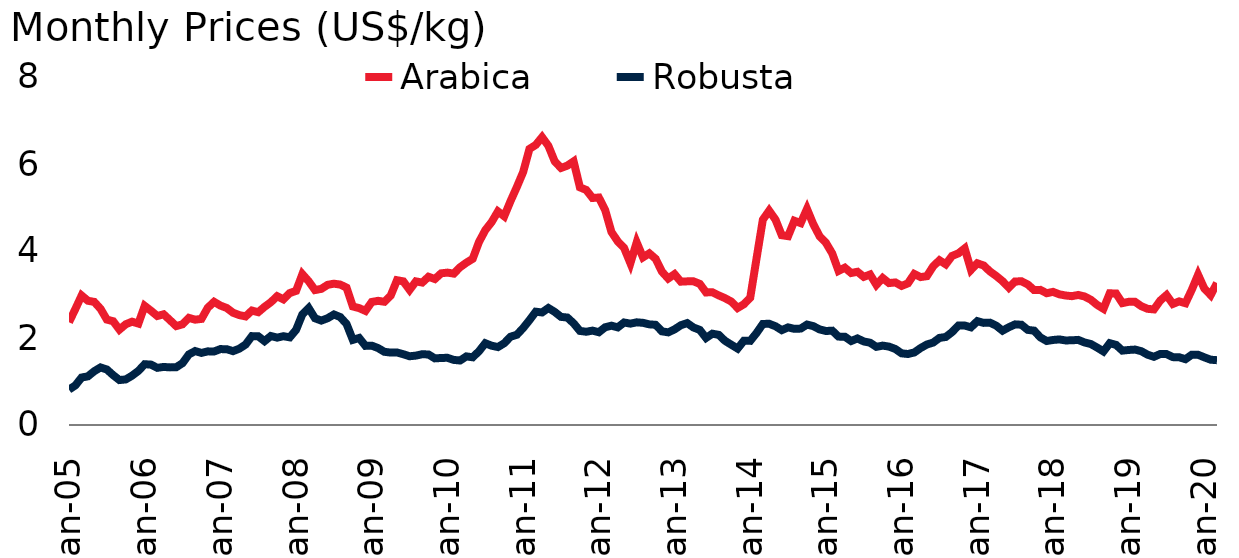
| Category | Arabica | Robusta |
|---|---|---|
| 2005-01-01 | 2.362 | 0.815 |
| 2005-02-01 | 2.665 | 0.909 |
| 2005-03-01 | 2.977 | 1.092 |
| 2005-04-01 | 2.856 | 1.119 |
| 2005-05-01 | 2.83 | 1.236 |
| 2005-06-01 | 2.671 | 1.323 |
| 2005-07-01 | 2.424 | 1.276 |
| 2005-08-01 | 2.385 | 1.146 |
| 2005-09-01 | 2.193 | 1.033 |
| 2005-10-01 | 2.316 | 1.048 |
| 2005-11-01 | 2.375 | 1.134 |
| 2005-12-01 | 2.332 | 1.243 |
| 2006-01-01 | 2.738 | 1.398 |
| 2006-02-01 | 2.626 | 1.388 |
| 2006-03-01 | 2.506 | 1.314 |
| 2006-04-01 | 2.545 | 1.335 |
| 2006-05-01 | 2.411 | 1.325 |
| 2006-06-01 | 2.274 | 1.328 |
| 2006-07-01 | 2.315 | 1.422 |
| 2006-08-01 | 2.463 | 1.622 |
| 2006-09-01 | 2.421 | 1.7 |
| 2006-10-01 | 2.439 | 1.657 |
| 2006-11-01 | 2.696 | 1.693 |
| 2006-12-01 | 2.832 | 1.69 |
| 2007-01-01 | 2.745 | 1.745 |
| 2007-02-01 | 2.69 | 1.743 |
| 2007-03-01 | 2.581 | 1.698 |
| 2007-04-01 | 2.526 | 1.754 |
| 2007-05-01 | 2.497 | 1.85 |
| 2007-06-01 | 2.631 | 2.043 |
| 2007-07-01 | 2.593 | 2.039 |
| 2007-08-01 | 2.716 | 1.928 |
| 2007-09-01 | 2.823 | 2.045 |
| 2007-10-01 | 2.961 | 2.008 |
| 2007-11-01 | 2.888 | 2.041 |
| 2007-12-01 | 3.033 | 2.015 |
| 2008-01-01 | 3.083 | 2.187 |
| 2008-02-01 | 3.468 | 2.545 |
| 2008-03-01 | 3.305 | 2.688 |
| 2008-04-01 | 3.102 | 2.454 |
| 2008-05-01 | 3.129 | 2.4 |
| 2008-06-01 | 3.222 | 2.455 |
| 2008-07-01 | 3.249 | 2.54 |
| 2008-08-01 | 3.228 | 2.482 |
| 2008-09-01 | 3.159 | 2.323 |
| 2008-10-01 | 2.725 | 1.957 |
| 2008-11-01 | 2.687 | 2.001 |
| 2008-12-01 | 2.623 | 1.819 |
| 2009-01-01 | 2.829 | 1.824 |
| 2009-02-01 | 2.855 | 1.769 |
| 2009-03-01 | 2.833 | 1.682 |
| 2009-04-01 | 2.974 | 1.665 |
| 2009-05-01 | 3.329 | 1.667 |
| 2009-06-01 | 3.302 | 1.627 |
| 2009-07-01 | 3.106 | 1.58 |
| 2009-08-01 | 3.302 | 1.595 |
| 2009-09-01 | 3.275 | 1.627 |
| 2009-10-01 | 3.408 | 1.621 |
| 2009-11-01 | 3.356 | 1.532 |
| 2009-12-01 | 3.487 | 1.541 |
| 2010-01-01 | 3.503 | 1.545 |
| 2010-02-01 | 3.48 | 1.496 |
| 2010-03-01 | 3.627 | 1.483 |
| 2010-04-01 | 3.731 | 1.577 |
| 2010-05-01 | 3.82 | 1.557 |
| 2010-06-01 | 4.209 | 1.696 |
| 2010-07-01 | 4.48 | 1.88 |
| 2010-08-01 | 4.665 | 1.823 |
| 2010-09-01 | 4.91 | 1.792 |
| 2010-10-01 | 4.798 | 1.88 |
| 2010-11-01 | 5.147 | 2.029 |
| 2010-12-01 | 5.471 | 2.074 |
| 2011-01-01 | 5.815 | 2.229 |
| 2011-02-01 | 6.347 | 2.411 |
| 2011-03-01 | 6.439 | 2.604 |
| 2011-04-01 | 6.617 | 2.588 |
| 2011-05-01 | 6.417 | 2.689 |
| 2011-06-01 | 6.062 | 2.6 |
| 2011-07-01 | 5.909 | 2.485 |
| 2011-08-01 | 5.962 | 2.471 |
| 2011-09-01 | 6.06 | 2.338 |
| 2011-10-01 | 5.463 | 2.163 |
| 2011-11-01 | 5.403 | 2.144 |
| 2011-12-01 | 5.219 | 2.17 |
| 2012-01-01 | 5.23 | 2.132 |
| 2012-02-01 | 4.942 | 2.247 |
| 2012-03-01 | 4.437 | 2.283 |
| 2012-04-01 | 4.221 | 2.244 |
| 2012-05-01 | 4.071 | 2.356 |
| 2012-06-01 | 3.719 | 2.33 |
| 2012-07-01 | 4.199 | 2.36 |
| 2012-08-01 | 3.854 | 2.348 |
| 2012-09-01 | 3.946 | 2.314 |
| 2012-10-01 | 3.821 | 2.303 |
| 2012-11-01 | 3.525 | 2.153 |
| 2012-12-01 | 3.367 | 2.129 |
| 2013-01-01 | 3.468 | 2.198 |
| 2013-02-01 | 3.295 | 2.293 |
| 2013-03-01 | 3.302 | 2.343 |
| 2013-04-01 | 3.303 | 2.242 |
| 2013-05-01 | 3.245 | 2.186 |
| 2013-06-01 | 3.048 | 2.001 |
| 2013-07-01 | 3.051 | 2.099 |
| 2013-08-01 | 2.98 | 2.073 |
| 2013-09-01 | 2.916 | 1.935 |
| 2013-10-01 | 2.837 | 1.845 |
| 2013-11-01 | 2.69 | 1.757 |
| 2013-12-01 | 2.777 | 1.938 |
| 2014-01-01 | 2.926 | 1.934 |
| 2014-02-01 | 3.828 | 2.114 |
| 2014-03-01 | 4.72 | 2.323 |
| 2014-04-01 | 4.927 | 2.327 |
| 2014-05-01 | 4.722 | 2.271 |
| 2014-06-01 | 4.363 | 2.181 |
| 2014-07-01 | 4.341 | 2.244 |
| 2014-08-01 | 4.695 | 2.21 |
| 2014-09-01 | 4.641 | 2.216 |
| 2014-10-01 | 4.967 | 2.308 |
| 2014-11-01 | 4.616 | 2.272 |
| 2014-12-01 | 4.339 | 2.197 |
| 2015-01-01 | 4.189 | 2.161 |
| 2015-02-01 | 3.944 | 2.168 |
| 2015-03-01 | 3.544 | 2.032 |
| 2015-04-01 | 3.616 | 2.03 |
| 2015-05-01 | 3.494 | 1.93 |
| 2015-06-01 | 3.522 | 1.99 |
| 2015-07-01 | 3.405 | 1.921 |
| 2015-08-01 | 3.459 | 1.891 |
| 2015-09-01 | 3.222 | 1.797 |
| 2015-10-01 | 3.379 | 1.825 |
| 2015-11-01 | 3.262 | 1.802 |
| 2015-12-01 | 3.277 | 1.748 |
| 2016-01-01 | 3.197 | 1.647 |
| 2016-02-01 | 3.256 | 1.632 |
| 2016-03-01 | 3.472 | 1.667 |
| 2016-04-01 | 3.4 | 1.768 |
| 2016-05-01 | 3.421 | 1.85 |
| 2016-06-01 | 3.648 | 1.895 |
| 2016-07-01 | 3.787 | 2.002 |
| 2016-08-01 | 3.694 | 2.024 |
| 2016-09-01 | 3.887 | 2.136 |
| 2016-10-01 | 3.945 | 2.285 |
| 2016-11-01 | 4.059 | 2.287 |
| 2016-12-01 | 3.567 | 2.245 |
| 2017-01-01 | 3.717 | 2.388 |
| 2017-02-01 | 3.667 | 2.348 |
| 2017-03-01 | 3.531 | 2.353 |
| 2017-04-01 | 3.426 | 2.284 |
| 2017-05-01 | 3.307 | 2.168 |
| 2017-06-01 | 3.157 | 2.248 |
| 2017-07-01 | 3.299 | 2.314 |
| 2017-08-01 | 3.304 | 2.304 |
| 2017-09-01 | 3.231 | 2.187 |
| 2017-10-01 | 3.102 | 2.169 |
| 2017-11-01 | 3.106 | 2.013 |
| 2017-12-01 | 3.03 | 1.931 |
| 2018-01-01 | 3.06 | 1.954 |
| 2018-02-01 | 3.004 | 1.967 |
| 2018-03-01 | 2.977 | 1.944 |
| 2018-04-01 | 2.962 | 1.947 |
| 2018-05-01 | 2.99 | 1.956 |
| 2018-06-01 | 2.955 | 1.898 |
| 2018-07-01 | 2.879 | 1.861 |
| 2018-08-01 | 2.76 | 1.78 |
| 2018-09-01 | 2.672 | 1.691 |
| 2018-10-01 | 3.028 | 1.881 |
| 2018-11-01 | 3.023 | 1.841 |
| 2018-12-01 | 2.802 | 1.71 |
| 2019-01-01 | 2.832 | 1.725 |
| 2019-02-01 | 2.832 | 1.734 |
| 2019-03-01 | 2.731 | 1.697 |
| 2019-04-01 | 2.67 | 1.616 |
| 2019-05-01 | 2.658 | 1.568 |
| 2019-06-01 | 2.86 | 1.632 |
| 2019-07-01 | 2.987 | 1.63 |
| 2019-08-01 | 2.783 | 1.56 |
| 2019-09-01 | 2.842 | 1.557 |
| 2019-10-01 | 2.8 | 1.513 |
| 2019-11-01 | 3.108 | 1.616 |
| 2019-12-01 | 3.455 | 1.614 |
| 2020-01-01 | 3.135 | 1.555 |
| 2020-02-01 | 2.987 | 1.501 |
| 2020-03-01 | 3.264 | 1.49 |